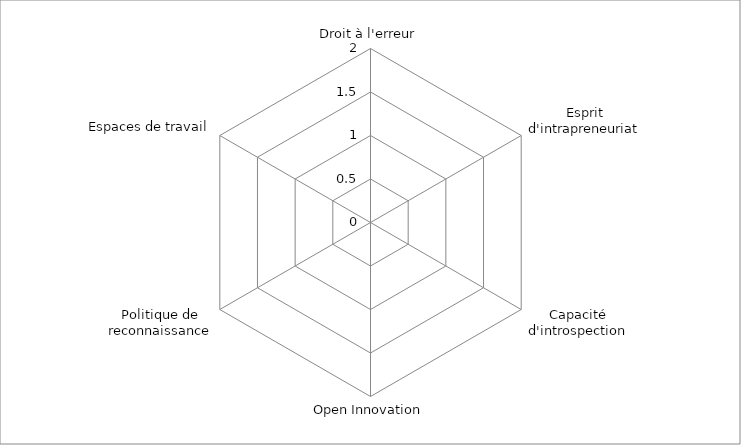
| Category | Series 0 |
|---|---|
| Droit à l'erreur | 0 |
| Esprit d'intrapreneuriat | 0 |
| Capacité d'introspection | 0 |
| Open Innovation | 0 |
| Politique de reconnaissance | 0 |
| Espaces de travail | 0 |